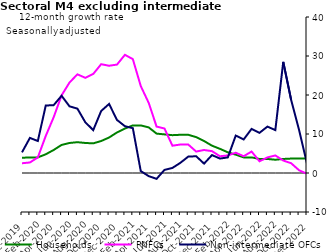
| Category | zero | Households | PNFCs | Non-intermediate OFCs |
|---|---|---|---|---|
| Dec-2019 | 0 | 3.9 | 2.5 | 5.3 |
| Jan-2020 | 0 | 4 | 2.7 | 9 |
| Feb-2020 | 0 | 4 | 4 | 8.2 |
| Mar-2020 | 0 | 4.8 | 9.5 | 17.3 |
| Apr-2020 | 0 | 5.9 | 14.3 | 17.4 |
| May-2020 | 0 | 7.2 | 19.9 | 19.8 |
| Jun-2020 | 0 | 7.7 | 23.2 | 17.1 |
| Jul-2020 | 0 | 7.9 | 25.3 | 16.5 |
| Aug-2020 | 0 | 7.7 | 24.4 | 13 |
| Sep-2020 | 0 | 7.6 | 25.4 | 11 |
| Oct-2020 | 0 | 8.2 | 27.9 | 15.9 |
| Nov-2020 | 0 | 9.1 | 27.5 | 17.7 |
| Dec-2020 | 0 | 10.4 | 27.8 | 13.6 |
| Jan-2021 | 0 | 11.4 | 30.3 | 12 |
| Feb-2021 | 0 | 12.2 | 29.2 | 11.5 |
| Mar-2021 | 0 | 12.2 | 22.3 | 0.5 |
| Apr-2021 | 0 | 11.7 | 18 | -0.8 |
| May-2021 | 0 | 10.1 | 11.9 | -1.5 |
| Jun-2021 | 0 | 9.9 | 11.4 | 0.8 |
| Jul-2021 | 0 | 9.7 | 7 | 1.3 |
| Aug-2021 | 0 | 9.8 | 7.3 | 2.6 |
| Sep-2021 | 0 | 9.8 | 7.3 | 4.2 |
| Oct-2021 | 0 | 9.2 | 5.5 | 4.3 |
| Nov-2021 | 0 | 8.2 | 5.9 | 2.4 |
| Dec-2021 | 0 | 7 | 5.6 | 4.6 |
| Jan-2022 | 0 | 6.2 | 4.3 | 3.7 |
| Feb-2022 | 0 | 5.3 | 4.5 | 4 |
| Mar-2022 | 0 | 4.7 | 5.2 | 9.6 |
| Apr-2022 | 0 | 4 | 4.3 | 8.6 |
| May-2022 | 0 | 4 | 5.5 | 11.3 |
| Jun-2022 | 0 | 3.6 | 3 | 10.3 |
| Jul-2022 | 0 | 3.6 | 4 | 11.9 |
| Aug-2022 | 0 | 3.4 | 4.5 | 11 |
| Sep-2022 | 0 | 3.6 | 3.2 | 28.5 |
| Oct-2022 | 0 | 3.7 | 2.5 | 18.7 |
| Nov-2022 | 0 | 3.7 | 0.7 | 11 |
| Dec-2022 | 0 | 3.7 | -0.2 | 2.4 |